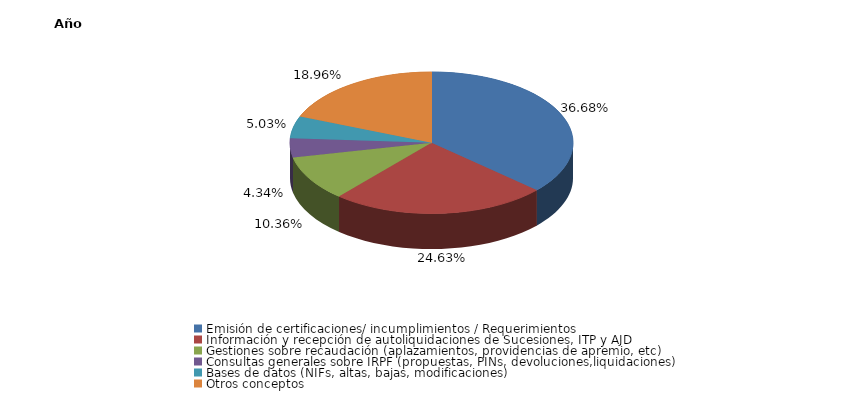
| Category | Series 0 |
|---|---|
| Emisión de certificaciones/ incumplimientos / Requerimientos | 0.367 |
| Información y recepción de autoliquidaciones de Sucesiones, ITP y AJD | 0.246 |
| Gestiones sobre recaudación (aplazamientos, providencias de apremio, etc) | 0.104 |
| Consultas generales sobre IRPF (propuestas, PINs, devoluciones,liquidaciones) | 0.043 |
| Bases de datos (NIFs, altas, bajas, modificaciones) | 0.05 |
| Otros conceptos | 0.19 |